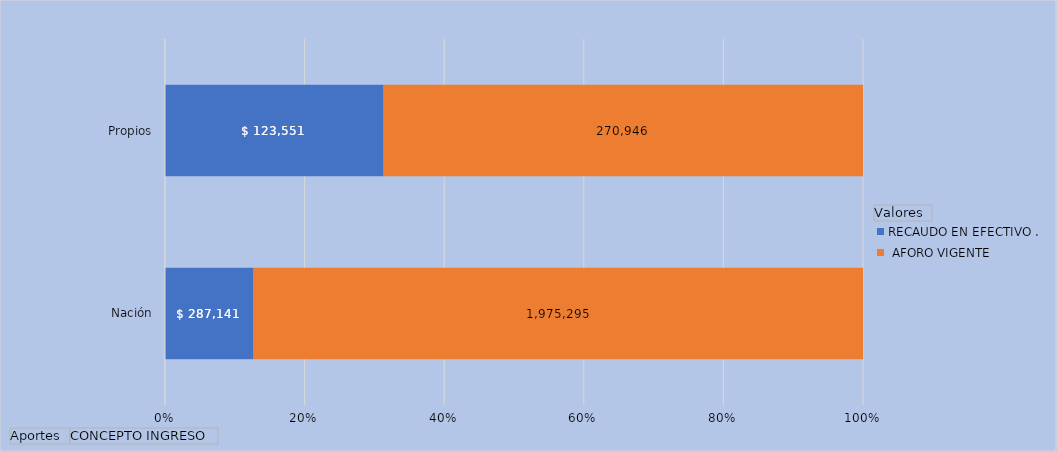
| Category | RECAUDO EN EFECTIVO . |  AFORO VIGENTE
 |
|---|---|---|
| Nación | 287140.548 | 1975294.901 |
| Propios | 123551.06 | 270945.743 |